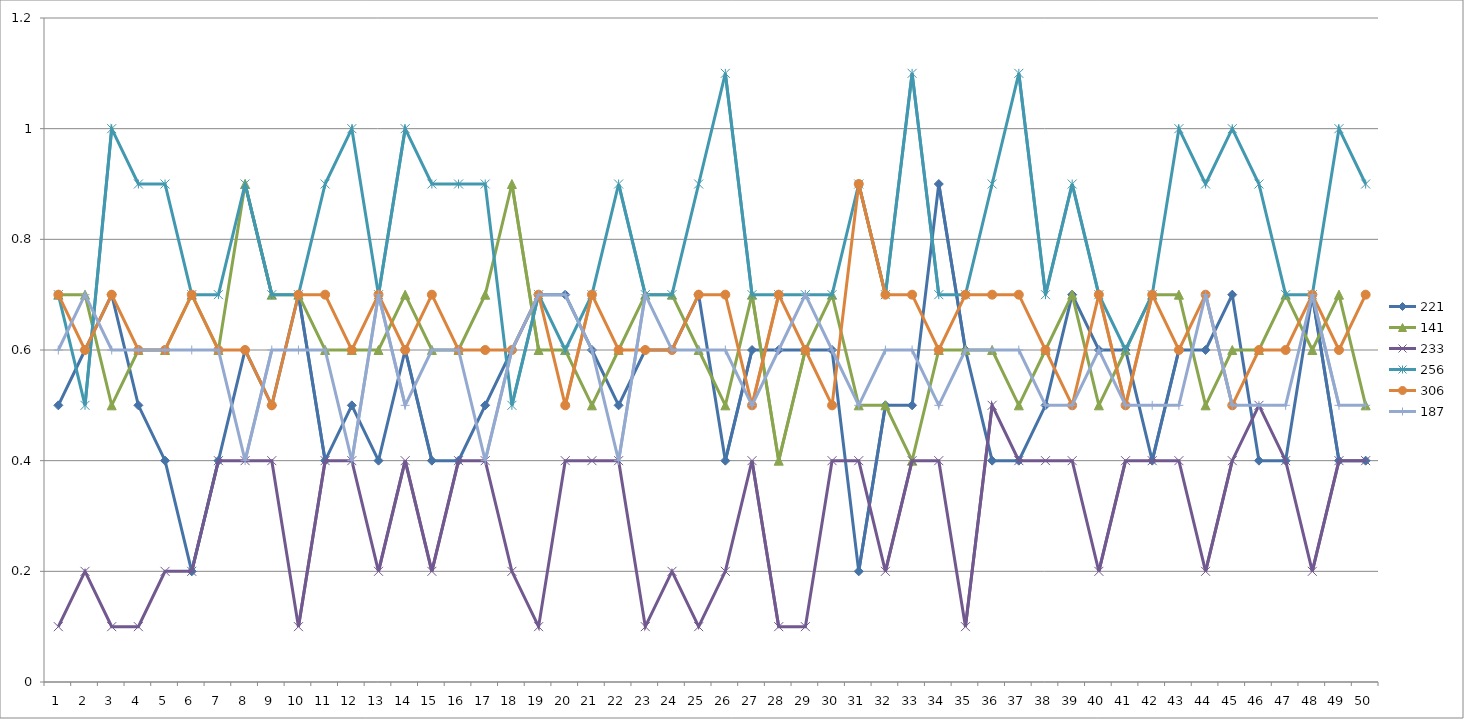
| Category | 221 | 141 | 233 | 256 | 306 | 187 |
|---|---|---|---|---|---|---|
| 0 | 0.5 | 0.7 | 0.1 | 0.7 | 0.7 | 0.6 |
| 1 | 0.6 | 0.7 | 0.2 | 0.5 | 0.6 | 0.7 |
| 2 | 0.7 | 0.5 | 0.1 | 1 | 0.7 | 0.6 |
| 3 | 0.5 | 0.6 | 0.1 | 0.9 | 0.6 | 0.6 |
| 4 | 0.4 | 0.6 | 0.2 | 0.9 | 0.6 | 0.6 |
| 5 | 0.2 | 0.7 | 0.2 | 0.7 | 0.7 | 0.6 |
| 6 | 0.4 | 0.6 | 0.4 | 0.7 | 0.6 | 0.6 |
| 7 | 0.6 | 0.9 | 0.4 | 0.9 | 0.6 | 0.4 |
| 8 | 0.5 | 0.7 | 0.4 | 0.7 | 0.5 | 0.6 |
| 9 | 0.7 | 0.7 | 0.1 | 0.7 | 0.7 | 0.6 |
| 10 | 0.4 | 0.6 | 0.4 | 0.9 | 0.7 | 0.6 |
| 11 | 0.5 | 0.6 | 0.4 | 1 | 0.6 | 0.4 |
| 12 | 0.4 | 0.6 | 0.2 | 0.7 | 0.7 | 0.7 |
| 13 | 0.6 | 0.7 | 0.4 | 1 | 0.6 | 0.5 |
| 14 | 0.4 | 0.6 | 0.2 | 0.9 | 0.7 | 0.6 |
| 15 | 0.4 | 0.6 | 0.4 | 0.9 | 0.6 | 0.6 |
| 16 | 0.5 | 0.7 | 0.4 | 0.9 | 0.6 | 0.4 |
| 17 | 0.6 | 0.9 | 0.2 | 0.5 | 0.6 | 0.6 |
| 18 | 0.7 | 0.6 | 0.1 | 0.7 | 0.7 | 0.7 |
| 19 | 0.7 | 0.6 | 0.4 | 0.6 | 0.5 | 0.7 |
| 20 | 0.6 | 0.5 | 0.4 | 0.7 | 0.7 | 0.6 |
| 21 | 0.5 | 0.6 | 0.4 | 0.9 | 0.6 | 0.4 |
| 22 | 0.6 | 0.7 | 0.1 | 0.7 | 0.6 | 0.7 |
| 23 | 0.6 | 0.7 | 0.2 | 0.7 | 0.6 | 0.6 |
| 24 | 0.7 | 0.6 | 0.1 | 0.9 | 0.7 | 0.6 |
| 25 | 0.4 | 0.5 | 0.2 | 1.1 | 0.7 | 0.6 |
| 26 | 0.6 | 0.7 | 0.4 | 0.7 | 0.5 | 0.5 |
| 27 | 0.6 | 0.4 | 0.1 | 0.7 | 0.7 | 0.6 |
| 28 | 0.6 | 0.6 | 0.1 | 0.7 | 0.6 | 0.7 |
| 29 | 0.6 | 0.7 | 0.4 | 0.7 | 0.5 | 0.6 |
| 30 | 0.2 | 0.5 | 0.4 | 0.9 | 0.9 | 0.5 |
| 31 | 0.5 | 0.5 | 0.2 | 0.7 | 0.7 | 0.6 |
| 32 | 0.5 | 0.4 | 0.4 | 1.1 | 0.7 | 0.6 |
| 33 | 0.9 | 0.6 | 0.4 | 0.7 | 0.6 | 0.5 |
| 34 | 0.6 | 0.6 | 0.1 | 0.7 | 0.7 | 0.6 |
| 35 | 0.4 | 0.6 | 0.5 | 0.9 | 0.7 | 0.6 |
| 36 | 0.4 | 0.5 | 0.4 | 1.1 | 0.7 | 0.6 |
| 37 | 0.5 | 0.6 | 0.4 | 0.7 | 0.6 | 0.5 |
| 38 | 0.7 | 0.7 | 0.4 | 0.9 | 0.5 | 0.5 |
| 39 | 0.6 | 0.5 | 0.2 | 0.7 | 0.7 | 0.6 |
| 40 | 0.6 | 0.6 | 0.4 | 0.6 | 0.5 | 0.5 |
| 41 | 0.4 | 0.7 | 0.4 | 0.7 | 0.7 | 0.5 |
| 42 | 0.6 | 0.7 | 0.4 | 1 | 0.6 | 0.5 |
| 43 | 0.6 | 0.5 | 0.2 | 0.9 | 0.7 | 0.7 |
| 44 | 0.7 | 0.6 | 0.4 | 1 | 0.5 | 0.5 |
| 45 | 0.4 | 0.6 | 0.5 | 0.9 | 0.6 | 0.5 |
| 46 | 0.4 | 0.7 | 0.4 | 0.7 | 0.6 | 0.5 |
| 47 | 0.7 | 0.6 | 0.2 | 0.7 | 0.7 | 0.7 |
| 48 | 0.4 | 0.7 | 0.4 | 1 | 0.6 | 0.5 |
| 49 | 0.4 | 0.5 | 0.4 | 0.9 | 0.7 | 0.5 |